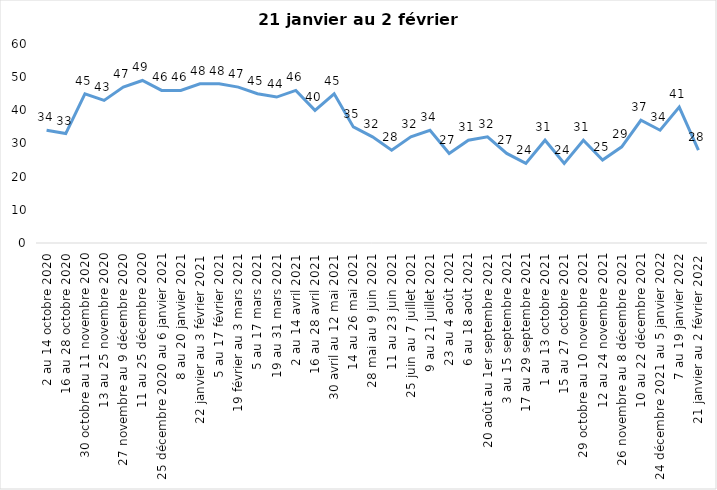
| Category | Toujours aux trois mesures |
|---|---|
| 2 au 14 octobre 2020 | 34 |
| 16 au 28 octobre 2020 | 33 |
| 30 octobre au 11 novembre 2020 | 45 |
| 13 au 25 novembre 2020 | 43 |
| 27 novembre au 9 décembre 2020 | 47 |
| 11 au 25 décembre 2020 | 49 |
| 25 décembre 2020 au 6 janvier 2021 | 46 |
| 8 au 20 janvier 2021 | 46 |
| 22 janvier au 3 février 2021 | 48 |
| 5 au 17 février 2021 | 48 |
| 19 février au 3 mars 2021 | 47 |
| 5 au 17 mars 2021 | 45 |
| 19 au 31 mars 2021 | 44 |
| 2 au 14 avril 2021 | 46 |
| 16 au 28 avril 2021 | 40 |
| 30 avril au 12 mai 2021 | 45 |
| 14 au 26 mai 2021 | 35 |
| 28 mai au 9 juin 2021 | 32 |
| 11 au 23 juin 2021 | 28 |
| 25 juin au 7 juillet 2021 | 32 |
| 9 au 21 juillet 2021 | 34 |
| 23 au 4 août 2021 | 27 |
| 6 au 18 août 2021 | 31 |
| 20 août au 1er septembre 2021 | 32 |
| 3 au 15 septembre 2021 | 27 |
| 17 au 29 septembre 2021 | 24 |
| 1 au 13 octobre 2021 | 31 |
| 15 au 27 octobre 2021 | 24 |
| 29 octobre au 10 novembre 2021 | 31 |
| 12 au 24 novembre 2021 | 25 |
| 26 novembre au 8 décembre 2021 | 29 |
| 10 au 22 décembre 2021 | 37 |
| 24 décembre 2021 au 5 janvier 2022 | 34 |
| 7 au 19 janvier 2022 | 41 |
| 21 janvier au 2 février 2022 | 28 |